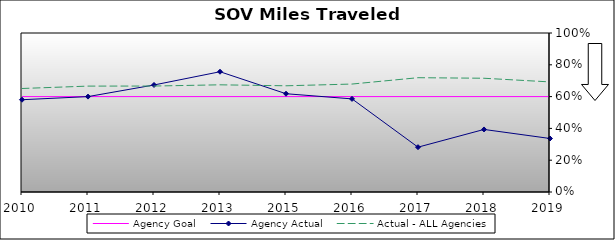
| Category | Agency Goal | Agency Actual | Actual - ALL Agencies |
|---|---|---|---|
| 2010.0 | 0.6 | 0.58 | 0.651 |
| 2011.0 | 0.6 | 0.6 | 0.666 |
| 2012.0 | 0.6 | 0.673 | 0.666 |
| 2013.0 | 0.6 | 0.756 | 0.674 |
| 2015.0 | 0.6 | 0.618 | 0.668 |
| 2016.0 | 0.6 | 0.586 | 0.679 |
| 2017.0 | 0.6 | 0.282 | 0.719 |
| 2018.0 | 0.6 | 0.393 | 0.715 |
| 2019.0 | 0.6 | 0.336 | 0.692 |